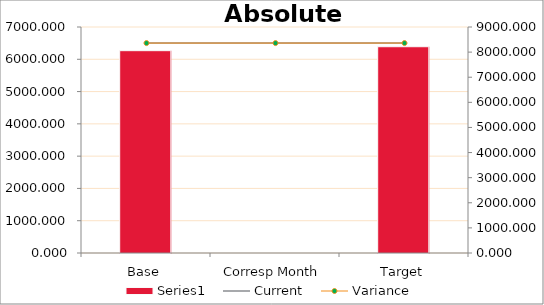
| Category | Series 0 |
|---|---|
| Base | 6266.495 |
| Corresp Month | 0 |
| Target | 6389.109 |